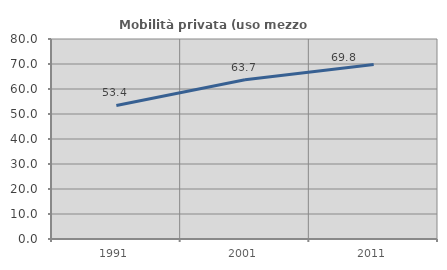
| Category | Mobilità privata (uso mezzo privato) |
|---|---|
| 1991.0 | 53.419 |
| 2001.0 | 63.667 |
| 2011.0 | 69.843 |